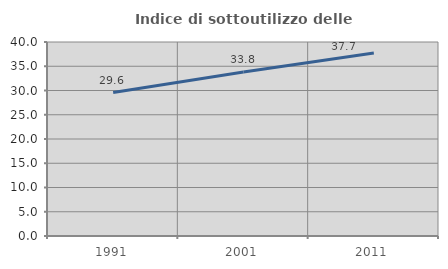
| Category | Indice di sottoutilizzo delle abitazioni  |
|---|---|
| 1991.0 | 29.577 |
| 2001.0 | 33.808 |
| 2011.0 | 37.716 |